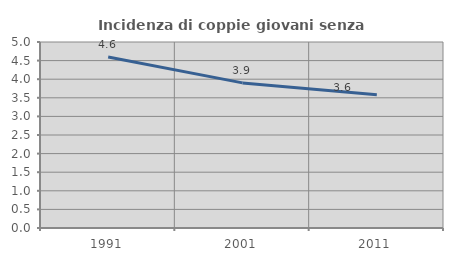
| Category | Incidenza di coppie giovani senza figli |
|---|---|
| 1991.0 | 4.599 |
| 2001.0 | 3.901 |
| 2011.0 | 3.583 |